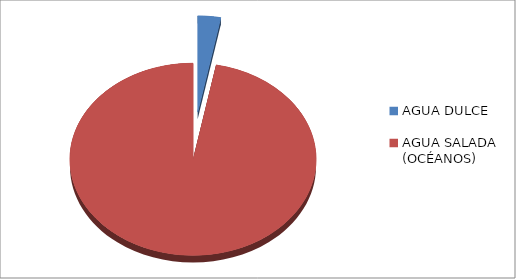
| Category | Series 0 |
|---|---|
| AGUA DULCE | 0.03 |
| AGUA SALADA
(OCÉANOS) | 0.97 |